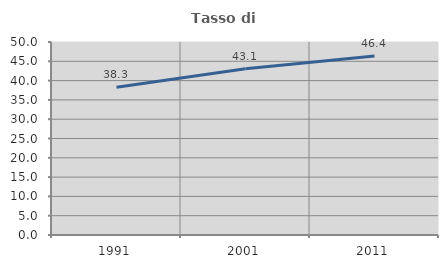
| Category | Tasso di occupazione   |
|---|---|
| 1991.0 | 38.264 |
| 2001.0 | 43.062 |
| 2011.0 | 46.369 |